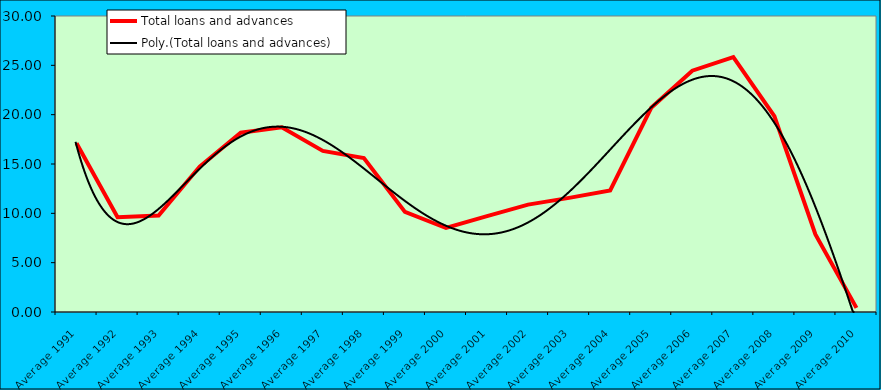
| Category | Total loans and advances |
|---|---|
| Average 1991 | 17.099 |
| Average 1992 | 9.614 |
| Average 1993 | 9.771 |
| Average 1994 | 14.737 |
| Average 1995 | 18.176 |
| Average 1996 | 18.729 |
| Average 1997 | 16.322 |
| Average 1998 | 15.608 |
| Average 1999 | 10.143 |
| Average 2000 | 8.514 |
| Average 2001 | 9.721 |
| Average 2002 | 10.884 |
| Average 2003 | 11.569 |
| Average 2004 | 12.319 |
| Average 2005 | 20.698 |
| Average 2006 | 24.459 |
| Average 2007 | 25.833 |
| Average 2008 | 19.852 |
| Average 2009 | 7.864 |
| Average 2010 | 0.418 |